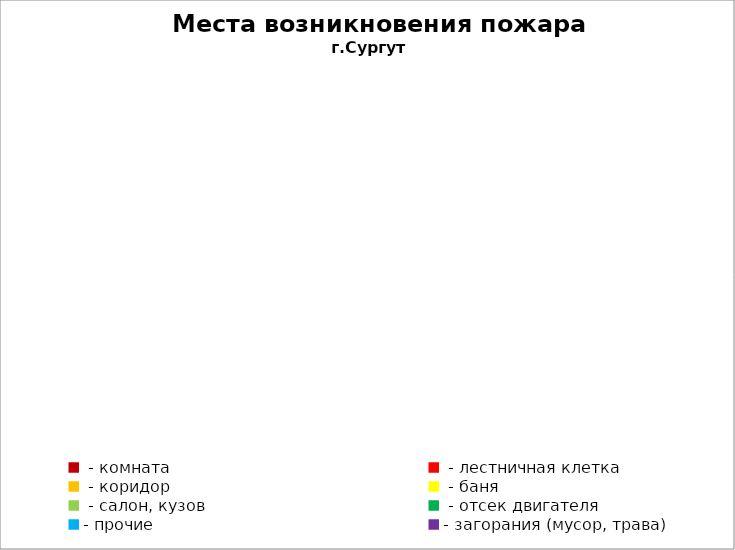
| Category | Места возникновения пожара |
|---|---|
|  - комната | 73 |
|  - лестничная клетка | 11 |
|  - коридор | 7 |
|  - баня | 42 |
|  - салон, кузов | 18 |
|  - отсек двигателя | 47 |
| - прочие | 123 |
| - загорания (мусор, трава)  | 127 |